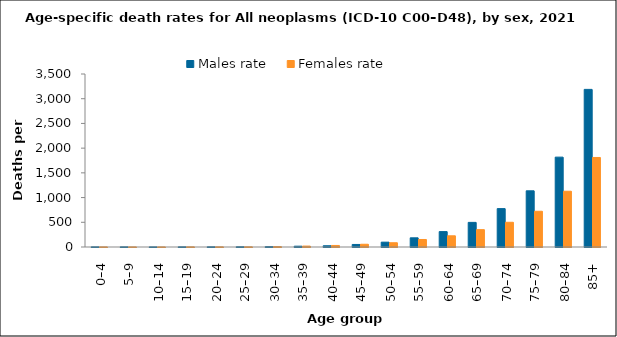
| Category | Males rate | Females rate |
|---|---|---|
| 0–4 | 2.963 | 1.908 |
| 5–9 | 2.886 | 1.783 |
| 10–14 | 2.035 | 1.268 |
| 15–19 | 3.281 | 2.926 |
| 20–24 | 4.062 | 3.052 |
| 25–29 | 5.009 | 3.541 |
| 30–34 | 7.868 | 8.341 |
| 35–39 | 16.267 | 18.634 |
| 40–44 | 25.249 | 31.242 |
| 45–49 | 51.389 | 55.48 |
| 50–54 | 97.966 | 86.005 |
| 55–59 | 185.695 | 152.037 |
| 60–64 | 311.449 | 226.575 |
| 65–69 | 498.108 | 350.887 |
| 70–74 | 776.647 | 500.269 |
| 75–79 | 1136.803 | 723.257 |
| 80–84 | 1818.276 | 1128.463 |
| 85+ | 3188.917 | 1811.07 |